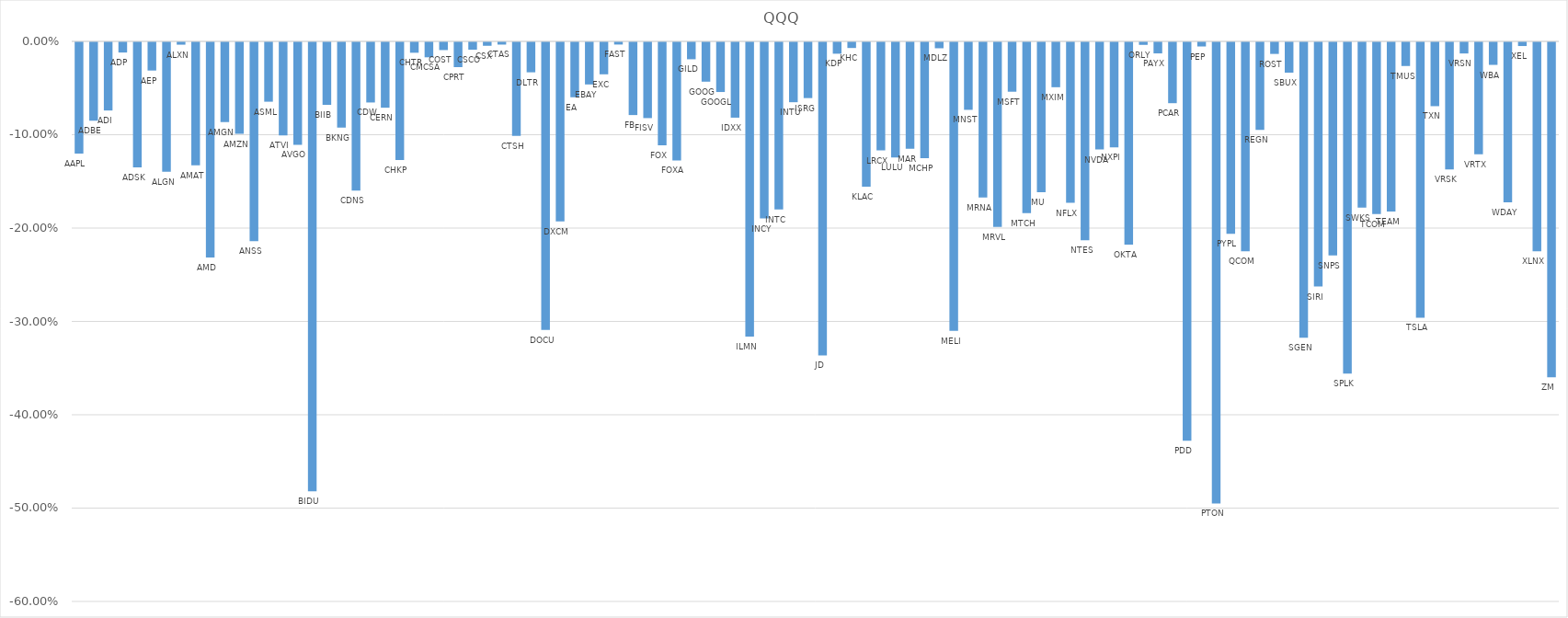
| Category | Series 0 |
|---|---|
| AAPL  | -0.119 |
| ADBE  | -0.084 |
| ADI  | -0.073 |
| ADP  | -0.011 |
| ADSK  | -0.134 |
| AEP  | -0.03 |
| ALGN  | -0.139 |
| ALXN  | -0.003 |
| AMAT  | -0.132 |
| AMD  | -0.231 |
| AMGN  | -0.086 |
| AMZN  | -0.098 |
| ANSS  | -0.213 |
| ASML  | -0.064 |
| ATVI  | -0.1 |
| AVGO  | -0.11 |
| BIDU  | -0.481 |
| BIIB  | -0.067 |
| BKNG  | -0.091 |
| CDNS  | -0.159 |
| CDW  | -0.064 |
| CERN  | -0.07 |
| CHKP  | -0.126 |
| CHTR  | -0.011 |
| CMCSA  | -0.016 |
| COST  | -0.008 |
| CPRT  | -0.027 |
| CSCO  | -0.008 |
| CSX  | -0.004 |
| CTAS  | -0.002 |
| CTSH  | -0.1 |
| DLTR  | -0.032 |
| DOCU  | -0.308 |
| DXCM  | -0.192 |
| EA  | -0.059 |
| EBAY  | -0.045 |
| EXC  | -0.034 |
| FAST  | -0.002 |
| FB  | -0.078 |
| FISV  | -0.081 |
| FOX  | -0.11 |
| FOXA  | -0.127 |
| GILD  | -0.018 |
| GOOG  | -0.042 |
| GOOGL  | -0.053 |
| IDXX  | -0.081 |
| ILMN  | -0.315 |
| INCY  | -0.189 |
| INTC  | -0.179 |
| INTU  | -0.064 |
| ISRG  | -0.06 |
| JD  | -0.335 |
| KDP  | -0.012 |
| KHC  | -0.006 |
| KLAC  | -0.155 |
| LRCX  | -0.116 |
| LULU  | -0.124 |
| MAR  | -0.114 |
| MCHP  | -0.124 |
| MDLZ  | -0.006 |
| MELI  | -0.309 |
| MNST  | -0.072 |
| MRNA  | -0.166 |
| MRVL  | -0.198 |
| MSFT  | -0.053 |
| MTCH  | -0.183 |
| MU  | -0.16 |
| MXIM  | -0.048 |
| NFLX  | -0.172 |
| NTES  | -0.212 |
| NVDA  | -0.115 |
| NXPI  | -0.113 |
| OKTA  | -0.217 |
| ORLY  | -0.003 |
| PAYX  | -0.012 |
| PCAR  | -0.065 |
| PDD  | -0.427 |
| PEP  | -0.004 |
| PTON  | -0.494 |
| PYPL  | -0.205 |
| QCOM  | -0.224 |
| REGN  | -0.094 |
| ROST  | -0.012 |
| SBUX  | -0.033 |
| SGEN  | -0.317 |
| SIRI  | -0.262 |
| SNPS  | -0.228 |
| SPLK  | -0.355 |
| SWKS  | -0.177 |
| TCOM  | -0.184 |
| TEAM  | -0.181 |
| TMUS  | -0.025 |
| TSLA  | -0.295 |
| TXN  | -0.068 |
| VRSK  | -0.136 |
| VRSN  | -0.012 |
| VRTX  | -0.12 |
| WBA  | -0.024 |
| WDAY  | -0.171 |
| XEL  | -0.004 |
| XLNX  | -0.224 |
| ZM  | -0.359 |